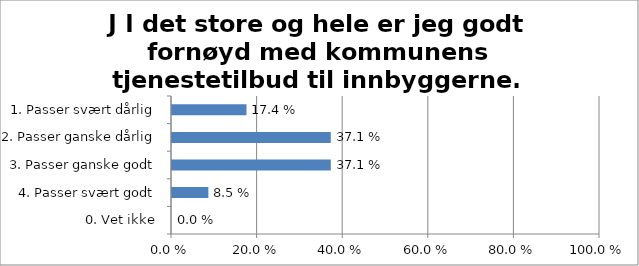
| Category | J I det store og hele er jeg godt fornøyd med kommunens tjenestetilbud til innbyggerne. |
|---|---|
| 1. Passer svært dårlig | 0.174 |
| 2. Passer ganske dårlig | 0.371 |
| 3. Passer ganske godt | 0.371 |
| 4. Passer svært godt | 0.085 |
| 0. Vet ikke | 0 |